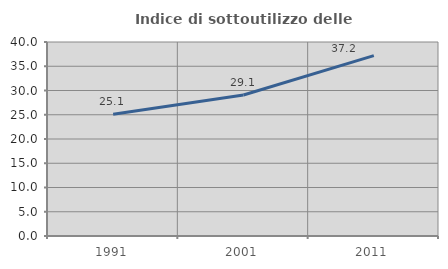
| Category | Indice di sottoutilizzo delle abitazioni  |
|---|---|
| 1991.0 | 25.123 |
| 2001.0 | 29.082 |
| 2011.0 | 37.195 |